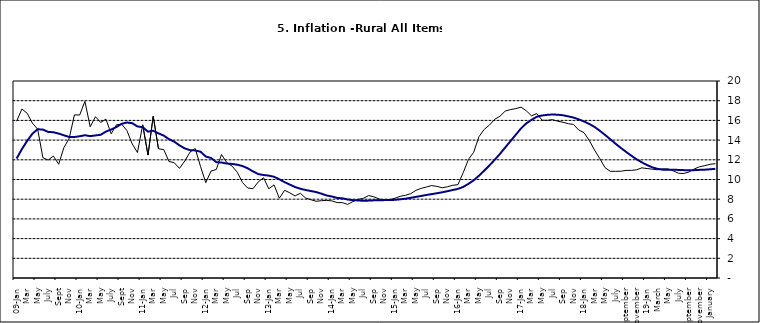
| Category | Series 0 | Series 1 |
|---|---|---|
| 09-Jan | 15.918 | 12.128 |
| Feb | 17.154 | 13.086 |
| Mar | 16.729 | 13.912 |
| Apr | 15.727 | 14.644 |
| May | 15.113 | 15.104 |
| June | 12.213 | 15.067 |
| July | 11.974 | 14.832 |
| Aug | 12.38 | 14.796 |
| Sept | 11.548 | 14.661 |
| Oct | 13.242 | 14.488 |
| Nov | 14.164 | 14.321 |
|  | 16.557 | 14.316 |
| 10-Jan | 16.548 | 14.39 |
| Feb | 17.934 | 14.494 |
| Mar | 15.346 | 14.401 |
| Apr | 16.373 | 14.473 |
| May | 15.794 | 14.54 |
| June | 16.126 | 14.862 |
| July | 14.634 | 15.072 |
| Aug | 15.556 | 15.33 |
| Sept | 15.616 | 15.658 |
| Oct | 14.955 | 15.786 |
| Nov | 13.616 | 15.719 |
| Dec | 12.735 | 15.385 |
| 11-Jan | 15.553 | 15.311 |
| Feb | 12.482 | 14.856 |
| Mar | 16.422 | 14.956 |
| Apr | 13.117 | 14.687 |
| May | 13.041 | 14.457 |
| Jun | 11.83 | 14.095 |
| Jul | 11.699 | 13.84 |
| Aug | 11.13 | 13.464 |
| Sep | 11.878 | 13.156 |
| Oct | 12.778 | 12.985 |
| Nov | 13.147 | 12.95 |
| Dec | 11.326 | 12.824 |
| 12-Jan | 9.678 | 12.33 |
| Feb | 10.856 | 12.188 |
| Mar | 11.014 | 11.76 |
| Apr | 12.536 | 11.724 |
| May | 11.712 | 11.621 |
| Jun | 11.36 | 11.582 |
| Jul | 10.733 | 11.499 |
| Aug | 9.683 | 11.368 |
| Sep | 9.132 | 11.131 |
| Oct | 9.071 | 10.82 |
| Nov | 9.758 | 10.548 |
| Dec | 10.183 | 10.455 |
| 13-Jan | 9.052 | 10.394 |
| Feb | 9.457 | 10.276 |
| Mar | 8.091 | 10.025 |
| Apr | 8.907 | 9.732 |
| May | 8.647 | 9.483 |
| Jun | 8.333 | 9.236 |
| Jul | 8.6 | 9.063 |
| Aug | 8.12 | 8.933 |
| Sep | 7.95 | 8.832 |
| Oct | 7.791 | 8.722 |
| Nov | 7.849 | 8.565 |
| Dec | 7.879 | 8.378 |
| 14-Jan | 7.832 | 8.277 |
| Feb | 7.657 | 8.13 |
| Mar | 7.65 | 8.092 |
| Apr | 7.473 | 7.973 |
| May | 7.761 | 7.901 |
| Jun | 7.98 | 7.874 |
| Jul | 8.086 | 7.834 |
| Aug | 8.368 | 7.858 |
| Sep | 8.244 | 7.883 |
| Oct | 8.019 | 7.903 |
| Nov | 7.898 | 7.906 |
| Dec | 7.955 | 7.913 |
| 15-Jan | 8.094 | 7.935 |
| Feb | 8.291 | 7.988 |
| Mar | 8.396 | 8.05 |
| Apr | 8.556 | 8.14 |
| May | 8.896 | 8.236 |
| Jun | 9.098 | 8.331 |
| Jul | 9.238 | 8.429 |
| Aug | 9.382 | 8.516 |
| Sep | 9.3 | 8.606 |
| Oct | 9.162 | 8.7 |
| Nov | 9.261 | 8.813 |
| Dec | 9.41 | 8.933 |
| 16-Jan | 9.48 | 9.047 |
| Feb | 10.692 | 9.249 |
| Mar | 12.038 | 9.559 |
| Apr | 12.767 | 9.917 |
| May | 14.349 | 10.384 |
| Jun | 15.088 | 10.897 |
| Jul | 15.533 | 11.433 |
| Aug | 16.103 | 12.002 |
| Sep | 16.428 | 12.601 |
| Oct | 16.947 | 13.25 |
| Nov | 17.099 | 13.898 |
| Dec | 17.195 | 14.54 |
| 17-Jan | 17.341 | 15.183 |
| Feb | 16.982 | 15.696 |
| Mar | 16.466 | 16.054 |
| Apr | 16.687 | 16.369 |
| May | 16.023 | 16.497 |
| Jun | 16.007 | 16.563 |
| Jul | 16.078 | 16.6 |
| Aug | 15.914 | 16.577 |
| Sep | 15.812 | 16.52 |
| Oct | 15.666 | 16.411 |
| Nov | 15.587 | 16.285 |
| Dec | 15.018 | 16.104 |
| 18-Jan | 14.756 | 15.892 |
| Feb | 13.957 | 15.638 |
| Mar | 12.987 | 15.339 |
| Apr | 12.126 | 14.95 |
| May | 11.199 | 14.53 |
| June | 10.832 | 14.083 |
| July | 10.831 | 13.636 |
| August | 10.838 | 13.209 |
| September | 10.924 | 12.804 |
| October | 10.927 | 12.418 |
| November | 10.986 | 12.049 |
| December | 11.183 | 11.746 |
| 19-Jan | 11.115 | 11.462 |
| February | 11.048 | 11.234 |
| March | 10.99 | 11.078 |
| April | 11.08 | 10.997 |
| May | 11.075 | 10.988 |
| June | 10.874 | 10.99 |
| July | 10.636 | 10.972 |
| August | 10.609 | 10.951 |
| September | 10.771 | 10.937 |
| October | 11.074 | 10.95 |
| November | 11.296 | 10.977 |
| December | 11.406 | 10.998 |
| January | 11.543 | 11.037 |
| February | 11.606 | 11.086 |